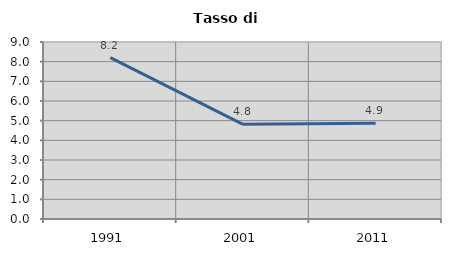
| Category | Tasso di disoccupazione   |
|---|---|
| 1991.0 | 8.207 |
| 2001.0 | 4.815 |
| 2011.0 | 4.871 |